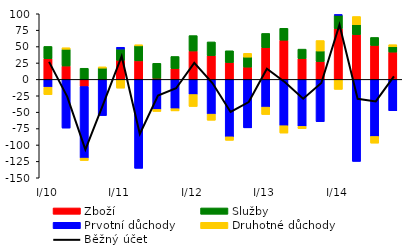
| Category | Zboží | Služby | Prvotní důchody | Druhotné důchody |
|---|---|---|---|---|
| I/10 | 31.462 | 18.784 | -11.909 | -11.331 |
| II | 20.388 | 25.54 | -74.248 | 2.332 |
| III | -10.892 | 16.968 | -109.141 | -3.653 |
| IV | -0.568 | 17.184 | -54.632 | 1.941 |
| I/11 | 28.994 | 17.24 | 2.716 | -13.37 |
| II | 28.218 | 22.874 | -135.675 | 1.741 |
| III | 1.774 | 22.739 | -45.729 | -3.187 |
| IV | 16.492 | 18.43 | -44.657 | -3.399 |
| I/12 | 43.281 | 23.478 | -23.083 | -18.258 |
| II | 36.152 | 20.972 | -52.981 | -9.36 |
| III | 25.681 | 17.923 | -87.565 | -5.364 |
| IV | 18.683 | 15.252 | -73.899 | 5.772 |
| I/13 | 48.355 | 21.702 | -42.281 | -11.28 |
| II | 59.692 | 18.186 | -70.624 | -11.218 |
| III | 31.672 | 14.458 | -71.638 | -3.56 |
| IV | 27.254 | 16.013 | -64.475 | 15.96 |
| I/14 | 77.394 | 20.418 | 1.008 | -15.254 |
| II | 68.219 | 15.152 | -125.09 | 12.495 |
| III | 51.694 | 12.235 | -87.004 | -10.21 |
| IV | 41.587 | 8.072 | -47.876 | 3.26 |